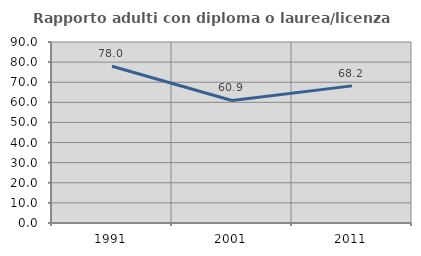
| Category | Rapporto adulti con diploma o laurea/licenza media  |
|---|---|
| 1991.0 | 77.966 |
| 2001.0 | 60.92 |
| 2011.0 | 68.182 |